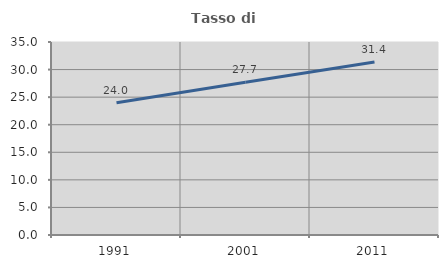
| Category | Tasso di occupazione   |
|---|---|
| 1991.0 | 23.99 |
| 2001.0 | 27.72 |
| 2011.0 | 31.377 |